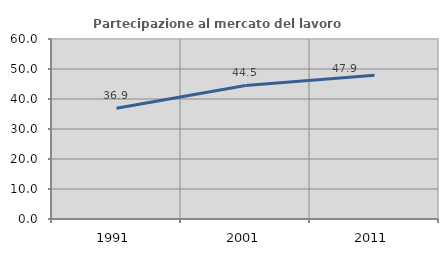
| Category | Partecipazione al mercato del lavoro  femminile |
|---|---|
| 1991.0 | 36.888 |
| 2001.0 | 44.524 |
| 2011.0 | 47.941 |